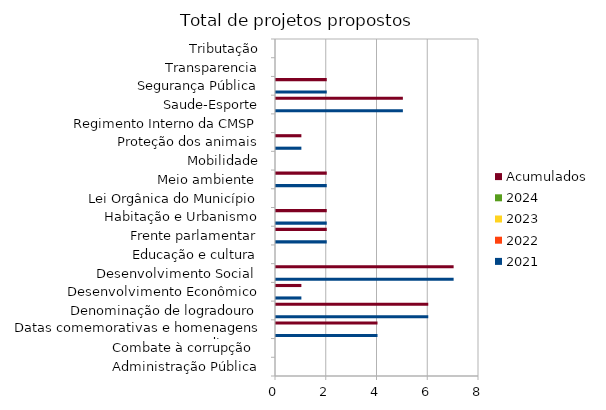
| Category | 2021 | 2022 | 2023 | 2024 | Acumulados |
|---|---|---|---|---|---|
| Administração Pública | 0 |  |  |  | 0 |
| Combate à corrupção  | 0 |  |  |  | 0 |
| Datas comemorativas e homenagens diversas | 4 |  |  |  | 4 |
| Denominação de logradouro | 6 |  |  |  | 6 |
| Desenvolvimento Econômico | 1 |  |  |  | 1 |
| Desenvolvimento Social  | 7 |  |  |  | 7 |
| Educação e cultura | 0 |  |  |  | 0 |
| Frente parlamentar | 2 |  |  |  | 2 |
| Habitação e Urbanismo | 2 |  |  |  | 2 |
| Lei Orgânica do Município | 0 |  |  |  | 0 |
| Meio ambiente  | 2 |  |  |  | 2 |
| Mobilidade | 0 |  |  |  | 0 |
| Proteção dos animais | 1 |  |  |  | 1 |
| Regimento Interno da CMSP | 0 |  |  |  | 0 |
| Saude-Esporte | 5 |  |  |  | 5 |
| Segurança Pública | 2 |  |  |  | 2 |
| Transparencia | 0 |  |  |  | 0 |
| Tributação | 0 |  |  |  | 0 |